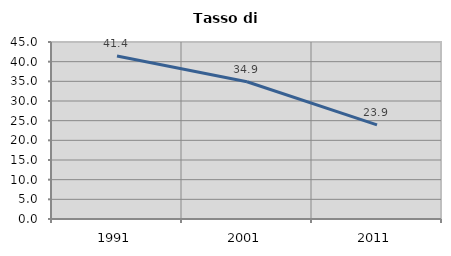
| Category | Tasso di disoccupazione   |
|---|---|
| 1991.0 | 41.446 |
| 2001.0 | 34.906 |
| 2011.0 | 23.929 |